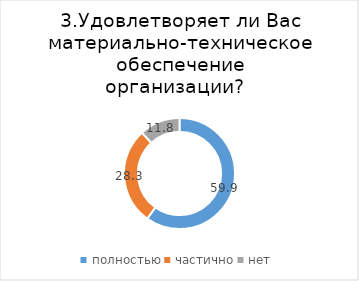
| Category | Series 0 |
|---|---|
| полностью | 59.868 |
| частично | 28.289 |
| нет | 11.842 |